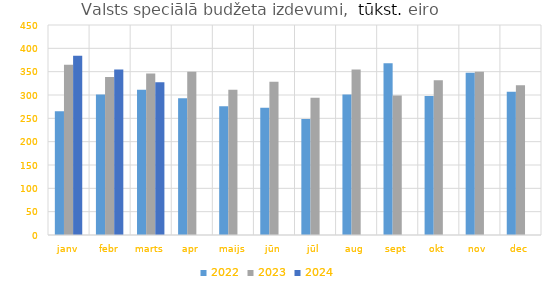
| Category | 2022 | 2023 | 2024 |
|---|---|---|---|
| janv | 265366.62 | 364905.213 | 384082.641 |
| febr | 301122.134 | 338753.3 | 354883.67 |
| marts | 311449.105 | 346087.76 | 327126.696 |
| apr | 292908.695 | 349816.348 | 0 |
| maijs | 276006.043 | 311041.84 | 0 |
| jūn | 272418.808 | 328139.664 | 0 |
| jūl | 248833.143 | 293936.464 | 0 |
| aug | 300867.01 | 354471.084 | 0 |
| sept | 368202.062 | 298878.279 | 0 |
| okt | 298051.418 | 331478.763 | 0 |
| nov | 347493.693 | 349793.266 | 0 |
| dec | 306911.749 | 320964.427 | 0 |